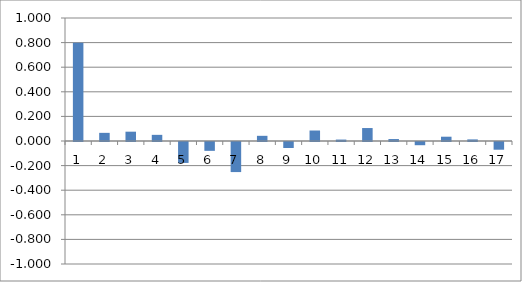
| Category | r(k,j) |
|---|---|
| 0 | 0.8 |
| 1 | 0.066 |
| 2 | 0.076 |
| 3 | 0.05 |
| 4 | -0.17 |
| 5 | -0.072 |
| 6 | -0.245 |
| 7 | 0.042 |
| 8 | -0.049 |
| 9 | 0.085 |
| 10 | 0.012 |
| 11 | 0.105 |
| 12 | 0.016 |
| 13 | -0.026 |
| 14 | 0.035 |
| 15 | 0.013 |
| 16 | -0.063 |